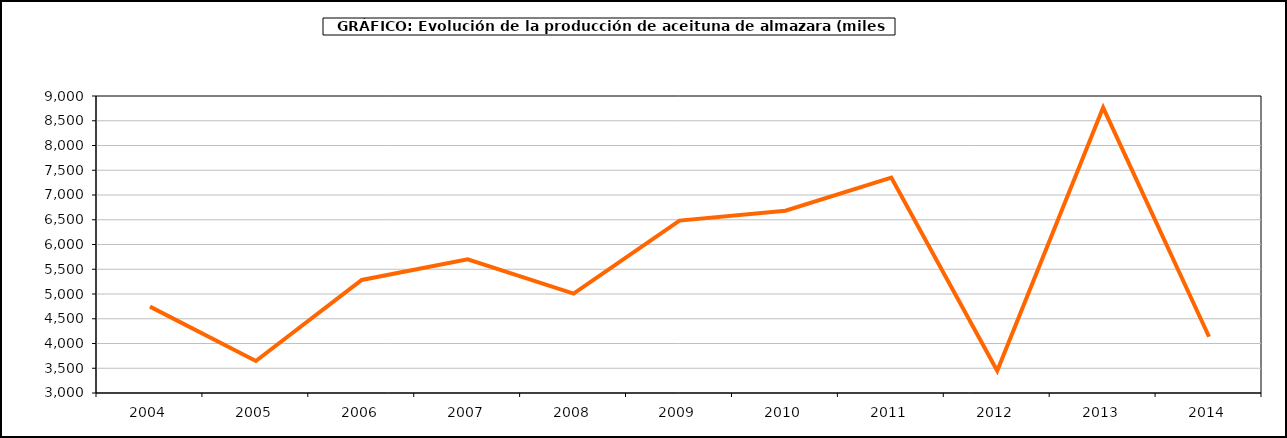
| Category | producción |
|---|---|
| 2004.0 | 4744.637 |
| 2005.0 | 3646.301 |
| 2006.0 | 5283.345 |
| 2007.0 | 5701.679 |
| 2008.0 | 5008.9 |
| 2009.0 | 6482.726 |
| 2010.0 | 6682.009 |
| 2011.0 | 7352.697 |
| 2012.0 | 3448.612 |
| 2013.0 | 8766.897 |
| 2014.0 | 4136.73 |